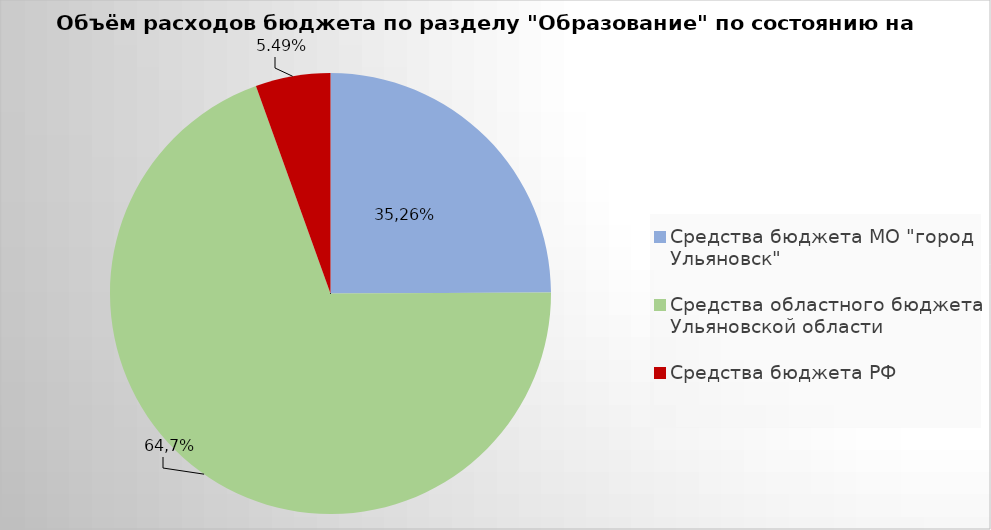
| Category | Series 0 |
|---|---|
| Средства бюджета МО "город Ульяновск" | 2187231.67 |
| Средства областного бюджета Ульяновской области | 6107370.19 |
| Средства бюджета РФ | 481889.6 |